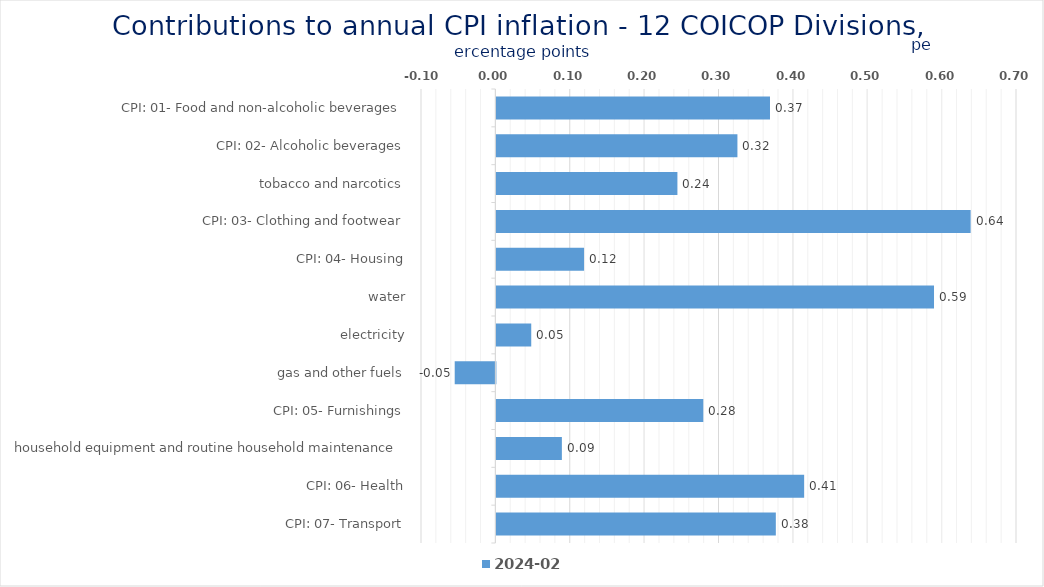
| Category | 2024-02 |
|---|---|
| CPI: 01- Food and non-alcoholic beverages | 0.368 |
| CPI: 02- Alcoholic beverages, tobacco and narcotics | 0.324 |
| CPI: 03- Clothing and footwear | 0.243 |
| CPI: 04- Housing, water, electricity, gas and other fuels | 0.638 |
| CPI: 05- Furnishings, household equipment and routine household maintenance | 0.118 |
| CPI: 06- Health | 0.588 |
| CPI: 07- Transport | 0.047 |
| CPI: 08- Communication | -0.055 |
| CPI: 09- Recreation and culture | 0.278 |
| CPI: 10- Education | 0.088 |
| CPI: 11- Restaurants and hotels | 0.414 |
| CPI: 12- Miscellaneous goods and services | 0.376 |